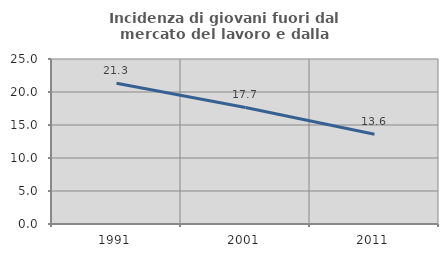
| Category | Incidenza di giovani fuori dal mercato del lavoro e dalla formazione  |
|---|---|
| 1991.0 | 21.324 |
| 2001.0 | 17.661 |
| 2011.0 | 13.603 |